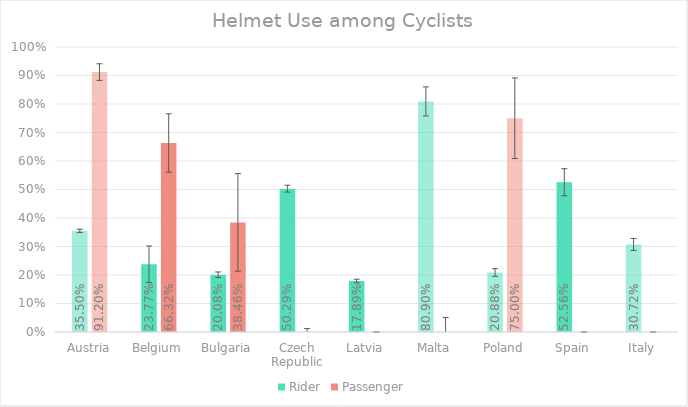
| Category | Rider | Passenger |
|---|---|---|
| Austria | 0.355 | 0.912 |
| Belgium | 0.238 | 0.663 |
| Bulgaria | 0.201 | 0.385 |
| Czech Republic | 0.503 | 0 |
| Latvia | 0.179 | 0 |
| Malta | 0.809 | 0 |
| Poland | 0.209 | 0.75 |
| Spain | 0.526 | 0 |
| Italy | 0.307 | 0 |